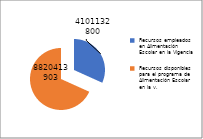
| Category | Series 0 |
|---|---|
| Recursos empleados en Alimentación Escolar en la Vigencia | 4101132800 |
| Recursos disponibles para el programa de Alimentación Escolar en la v. | 8820413903 |